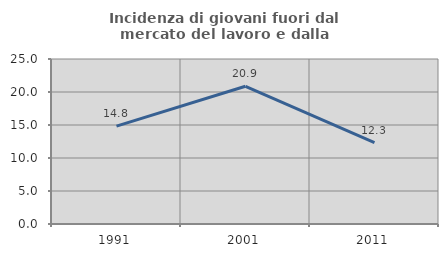
| Category | Incidenza di giovani fuori dal mercato del lavoro e dalla formazione  |
|---|---|
| 1991.0 | 14.838 |
| 2001.0 | 20.865 |
| 2011.0 | 12.341 |